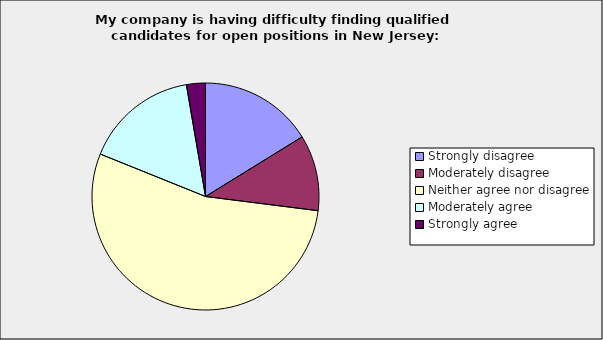
| Category | Series 0 |
|---|---|
| Strongly disagree | 0.162 |
| Moderately disagree | 0.108 |
| Neither agree nor disagree | 0.541 |
| Moderately agree | 0.162 |
| Strongly agree | 0.027 |